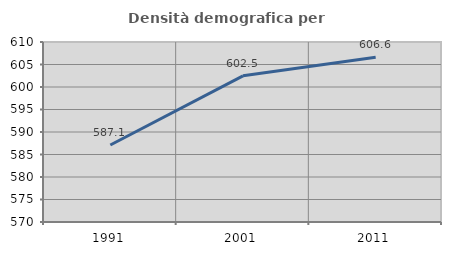
| Category | Densità demografica |
|---|---|
| 1991.0 | 587.11 |
| 2001.0 | 602.483 |
| 2011.0 | 606.596 |